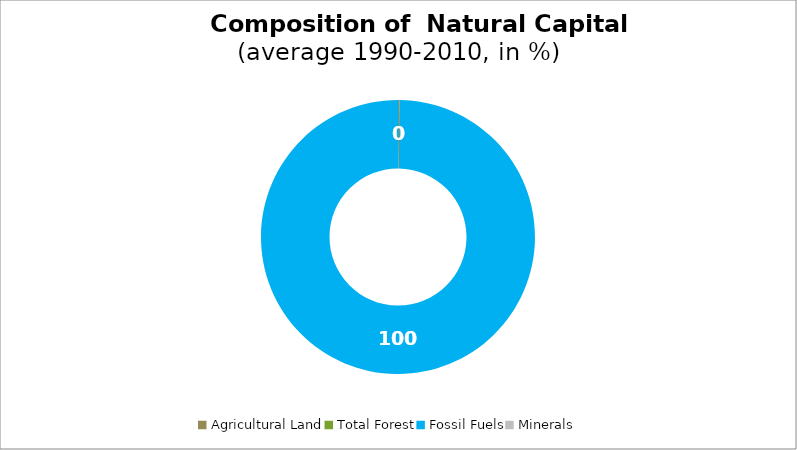
| Category | Series 0 |
|---|---|
| Agricultural Land | 0.158 |
| Total Forest | 0 |
| Fossil Fuels | 99.842 |
| Minerals | 0 |